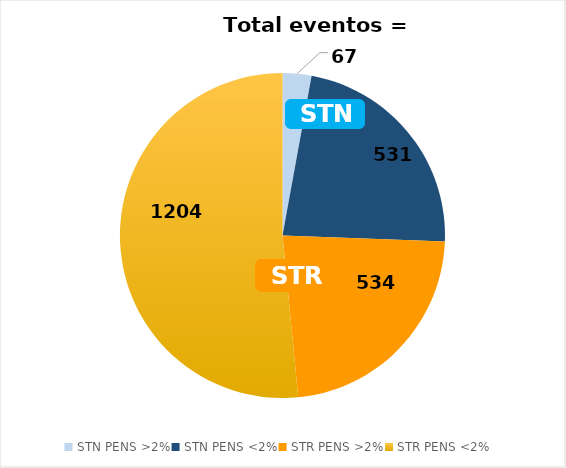
| Category | eventos |
|---|---|
| STN PENS >2% | 67 |
| STN PENS <2% | 531 |
| STR PENS >2% | 534 |
| STR PENS <2% | 1204 |